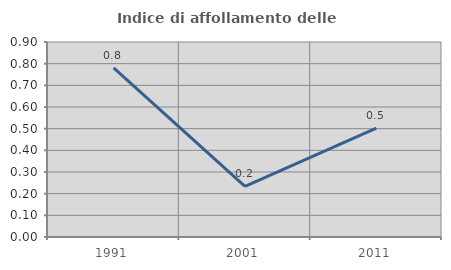
| Category | Indice di affollamento delle abitazioni  |
|---|---|
| 1991.0 | 0.78 |
| 2001.0 | 0.234 |
| 2011.0 | 0.502 |